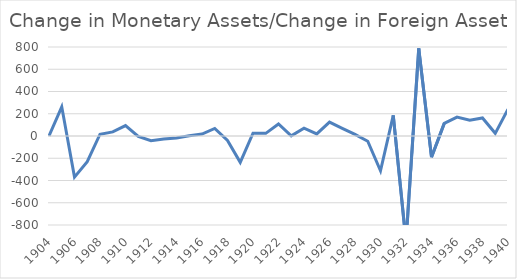
| Category | Change in Monetary Assets/Change in Foreign Assets |
|---|---|
| 1904.0 | 0 |
| 1905.0 | 261.998 |
| 1906.0 | -369.665 |
| 1907.0 | -230.819 |
| 1908.0 | 15.799 |
| 1909.0 | 36.702 |
| 1910.0 | 93.623 |
| 1911.0 | -3.536 |
| 1912.0 | -42.035 |
| 1913.0 | -27.054 |
| 1914.0 | -17.126 |
| 1915.0 | 2.531 |
| 1916.0 | 16.979 |
| 1917.0 | 67.78 |
| 1918.0 | -40.029 |
| 1919.0 | -236.88 |
| 1920.0 | 24.562 |
| 1921.0 | 23.73 |
| 1922.0 | 107.789 |
| 1923.0 | 1.762 |
| 1924.0 | 70.249 |
| 1925.0 | 18.269 |
| 1926.0 | 125.333 |
| 1927.0 | 69.195 |
| 1928.0 | 15.201 |
| 1929.0 | -47.334 |
| 1930.0 | -312.785 |
| 1931.0 | 185.202 |
| 1932.0 | -948.074 |
| 1933.0 | 788.054 |
| 1934.0 | -190.288 |
| 1935.0 | 113.498 |
| 1936.0 | 169.992 |
| 1937.0 | 141.04 |
| 1938.0 | 162.19 |
| 1939.0 | 24.025 |
| 1940.0 | 240.676 |